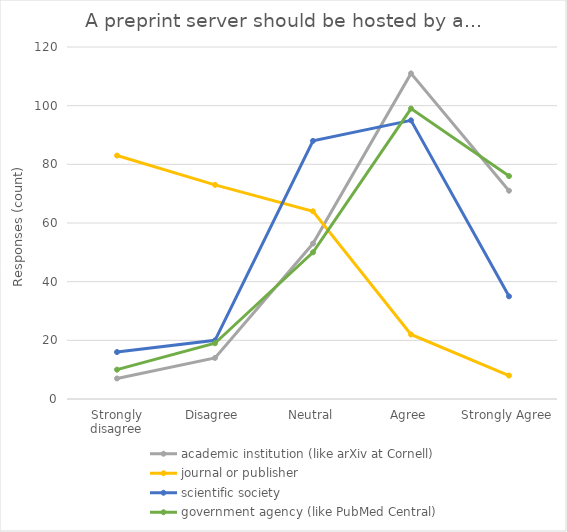
| Category | academic institution (like arXiv at Cornell) | journal or publisher | scientific society | government agency (like PubMed Central) |
|---|---|---|---|---|
| Strongly disagree | 7 | 83 | 16 | 10 |
| Disagree | 14 | 73 | 20 | 19 |
| Neutral | 53 | 64 | 88 | 50 |
| Agree | 111 | 22 | 95 | 99 |
| Strongly Agree | 71 | 8 | 35 | 76 |